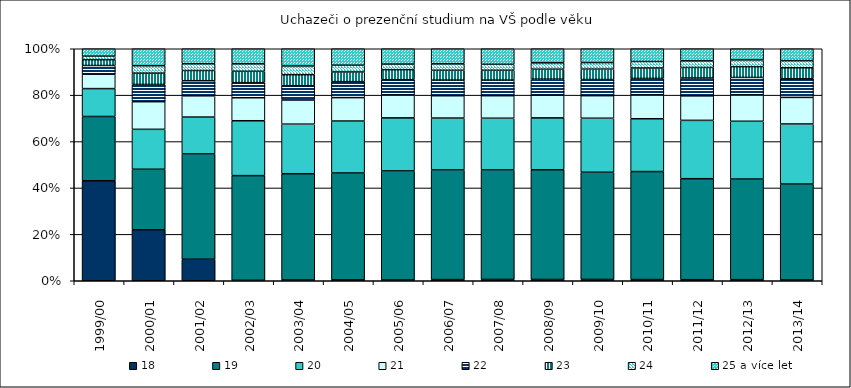
| Category | 18 | 19 | 20 | 21 | 22 | 23 | 24 | 25 a více let  |
|---|---|---|---|---|---|---|---|---|
| 1999/00 | 0.431 | 0.277 | 0.12 | 0.062 | 0.038 | 0.025 | 0.015 | 0.032 |
| 2000/01 | 0.22 | 0.261 | 0.172 | 0.119 | 0.074 | 0.049 | 0.032 | 0.073 |
| 2001/02 | 0.093 | 0.454 | 0.159 | 0.091 | 0.065 | 0.044 | 0.029 | 0.065 |
| 2002/03 | 0.002 | 0.45 | 0.236 | 0.099 | 0.065 | 0.049 | 0.032 | 0.065 |
| 2003/04 | 0.003 | 0.457 | 0.213 | 0.104 | 0.061 | 0.048 | 0.037 | 0.074 |
| 2004/05 | 0.004 | 0.46 | 0.224 | 0.101 | 0.069 | 0.042 | 0.029 | 0.071 |
| 2005/06 | 0.003 | 0.47 | 0.229 | 0.098 | 0.066 | 0.043 | 0.024 | 0.066 |
| 2006/07 | 0.005 | 0.473 | 0.224 | 0.096 | 0.067 | 0.043 | 0.028 | 0.065 |
| 2007/08 | 0.006 | 0.472 | 0.223 | 0.097 | 0.067 | 0.043 | 0.026 | 0.067 |
| 2008/09 | 0.005 | 0.473 | 0.224 | 0.098 | 0.069 | 0.043 | 0.027 | 0.061 |
| 2009/10 | 0.006 | 0.462 | 0.233 | 0.097 | 0.07 | 0.045 | 0.028 | 0.06 |
| 2010/11 | 0.005 | 0.465 | 0.228 | 0.103 | 0.071 | 0.045 | 0.028 | 0.055 |
| 2011/12 | 0.005 | 0.435 | 0.252 | 0.106 | 0.077 | 0.046 | 0.029 | 0.052 |
| 2012/13 | 0.005 | 0.434 | 0.249 | 0.114 | 0.075 | 0.046 | 0.029 | 0.048 |
| 2013/14 | 0.003 | 0.413 | 0.259 | 0.114 | 0.08 | 0.048 | 0.031 | 0.051 |